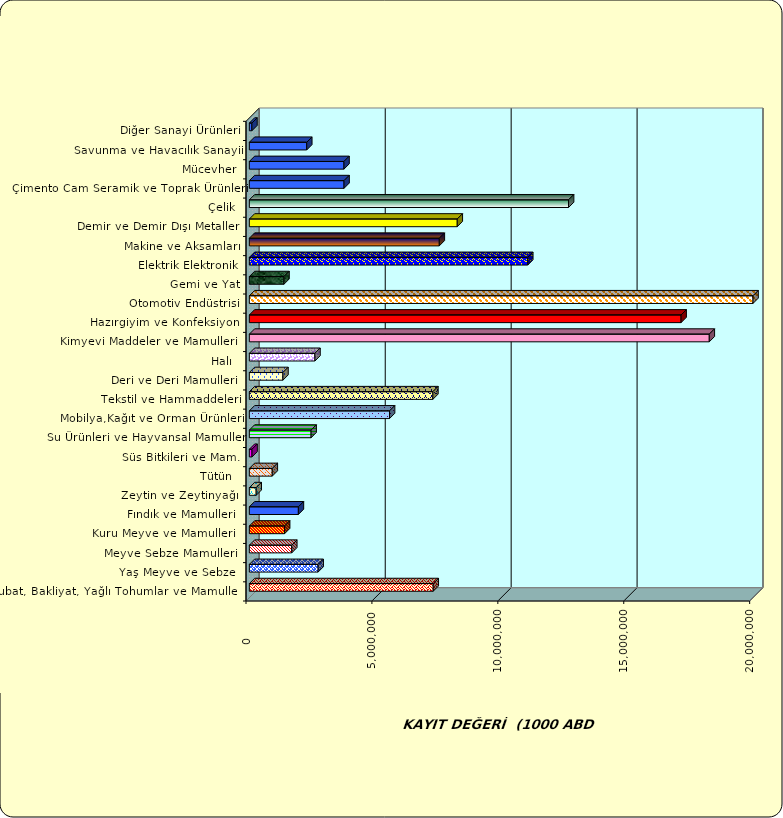
| Category | Series 0 |
|---|---|
|  Hububat, Bakliyat, Yağlı Tohumlar ve Mamulleri  | 7301341.477 |
|  Yaş Meyve ve Sebze   | 2731186.189 |
|  Meyve Sebze Mamulleri  | 1683745.56 |
|  Kuru Meyve ve Mamulleri   | 1399574.347 |
|  Fındık ve Mamulleri  | 1946988.911 |
|  Zeytin ve Zeytinyağı  | 271182.252 |
|  Tütün  | 910530.863 |
|  Süs Bitkileri ve Mam. | 106156.707 |
|  Su Ürünleri ve Hayvansal Mamuller | 2451931.069 |
|  Mobilya,Kağıt ve Orman Ürünleri | 5566505.484 |
|  Tekstil ve Hammaddeleri | 7286561.164 |
|  Deri ve Deri Mamulleri  | 1333274.046 |
|  Halı  | 2604648.392 |
|  Kimyevi Maddeler ve Mamulleri   | 18263488.437 |
|  Hazırgiyim ve Konfeksiyon  | 17143440.904 |
|  Otomotiv Endüstrisi | 25548566.204 |
|  Gemi ve Yat | 1375006.355 |
|  Elektrik Elektronik | 11055081.99 |
|  Makine ve Aksamları | 7542788.669 |
|  Demir ve Demir Dışı Metaller  | 8255705.02 |
|  Çelik | 12675178.921 |
|  Çimento Cam Seramik ve Toprak Ürünleri | 3759686.729 |
|  Mücevher | 3757744.172 |
|  Savunma ve Havacılık Sanayii | 2279026.801 |
|  Diğer Sanayi Ürünleri | 100548.375 |